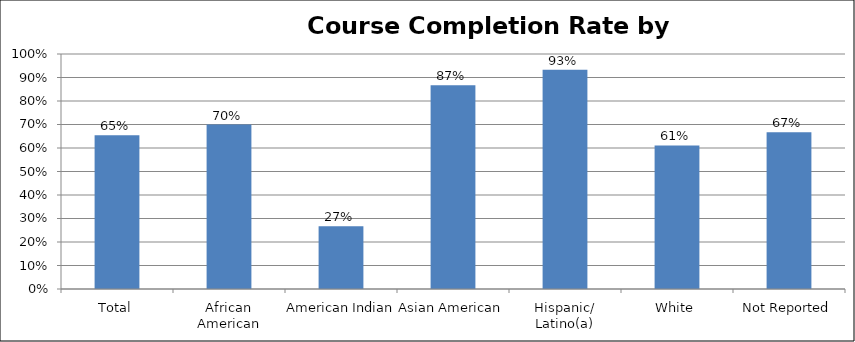
| Category | Course Completion Rate |
|---|---|
| Total | 0.655 |
| African American | 0.7 |
| American Indian | 0.267 |
| Asian American | 0.867 |
| Hispanic/ Latino(a) | 0.933 |
| White | 0.611 |
| Not Reported | 0.667 |